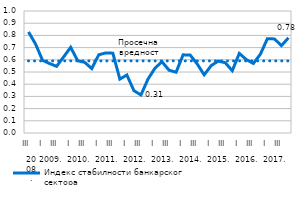
| Category | Индекс стабилности банкарског сектора | Просечна вредност |
|---|---|---|
| 0 | 0.828 | 0.591 |
| 1 | 0.729 | 0.591 |
| 2 | 0.596 | 0.591 |
| 3 | 0.569 | 0.591 |
| 4 | 0.547 | 0.591 |
| 5 | 0.624 | 0.591 |
| 6 | 0.702 | 0.591 |
| 7 | 0.592 | 0.591 |
| 8 | 0.579 | 0.591 |
| 9 | 0.528 | 0.591 |
| 10 | 0.641 | 0.591 |
| 11 | 0.656 | 0.591 |
| 12 | 0.654 | 0.591 |
| 13 | 0.442 | 0.591 |
| 14 | 0.475 | 0.591 |
| 15 | 0.347 | 0.591 |
| 16 | 0.312 | 0.591 |
| 17 | 0.441 | 0.591 |
| 18 | 0.532 | 0.591 |
| 19 | 0.584 | 0.591 |
| 20 | 0.515 | 0.591 |
| 21 | 0.498 | 0.591 |
| 22 | 0.641 | 0.591 |
| 23 | 0.64 | 0.591 |
| 24 | 0.567 | 0.591 |
| 25 | 0.477 | 0.591 |
| 26 | 0.552 | 0.591 |
| 27 | 0.59 | 0.591 |
| 28 | 0.576 | 0.591 |
| 29 | 0.511 | 0.591 |
| 30 | 0.652 | 0.591 |
| 31 | 0.602 | 0.591 |
| 32 | 0.57 | 0.591 |
| 33 | 0.646 | 0.591 |
| 34 | 0.773 | 0.591 |
| 35 | 0.771 | 0.591 |
| 36 | 0.716 | 0.591 |
| 37 | 0.78 | 0.591 |